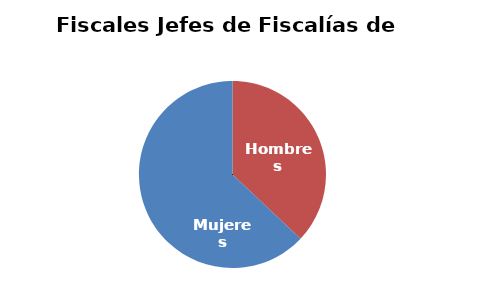
| Category | Fiscales Jefes de Fiscalías de Área  |
|---|---|
| Hombres | 10 |
| Mujeres | 17 |